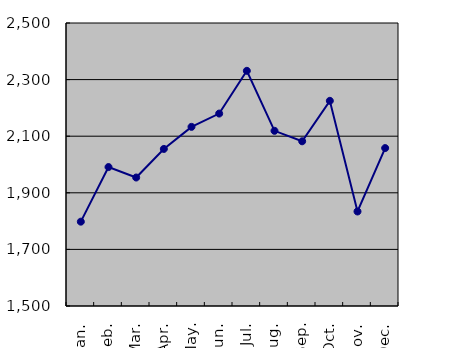
| Category | Series 0 |
|---|---|
| Jan. | 1798 |
| Feb. | 1991 |
| Mar. | 1954 |
| Apr. | 2055 |
| May. | 2133 |
| Jun. | 2180 |
| Jul. | 2331 |
| Aug. | 2119 |
| Sep. | 2082 |
| Oct. | 2225 |
| Nov. | 1834 |
| Dec. | 2058 |